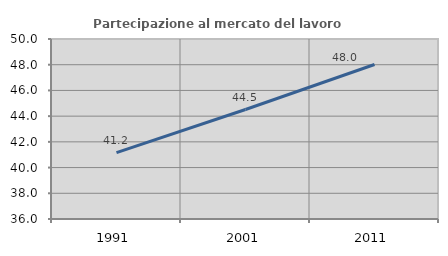
| Category | Partecipazione al mercato del lavoro  femminile |
|---|---|
| 1991.0 | 41.166 |
| 2001.0 | 44.516 |
| 2011.0 | 48.017 |